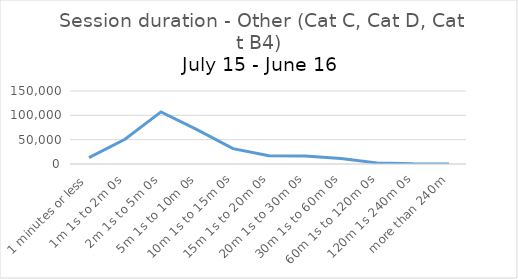
| Category | Other (Cat C, Cat D, Cat B4) |
|---|---|
| 1 minutes or less | 12975 |
| 1m 1s to 2m 0s | 50792 |
| 2m 1s to 5m 0s | 107021 |
| 5m 1s to 10m 0s | 70616 |
| 10m 1s to 15m 0s | 31594 |
| 15m 1s to 20m 0s | 17003 |
| 20m 1s to 30m 0s | 16358 |
| 30m 1s to 60m 0s | 11450 |
| 60m 1s to 120m 0s | 2260 |
| 120m 1s 240m 0s | 303 |
| more than 240m | 18 |